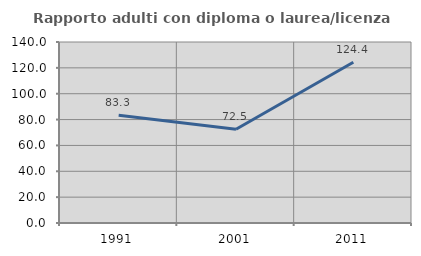
| Category | Rapporto adulti con diploma o laurea/licenza media  |
|---|---|
| 1991.0 | 83.333 |
| 2001.0 | 72.5 |
| 2011.0 | 124.39 |